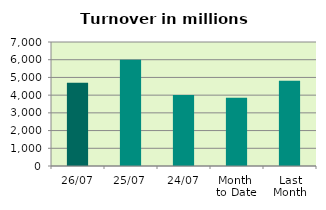
| Category | Series 0 |
|---|---|
| 26/07 | 4705.668 |
| 25/07 | 5991.286 |
| 24/07 | 4008.9 |
| Month 
to Date | 3846.693 |
| Last
Month | 4815.104 |